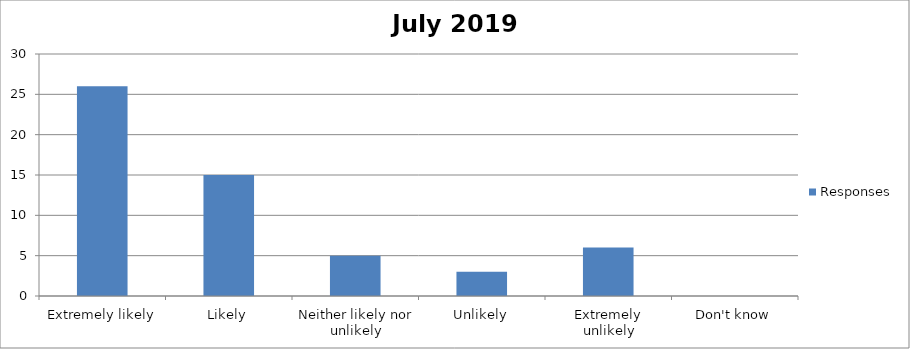
| Category | Responses |
|---|---|
| Extremely likely | 26 |
| Likely | 15 |
| Neither likely nor unlikely | 5 |
| Unlikely | 3 |
| Extremely unlikely | 6 |
| Don't know | 0 |